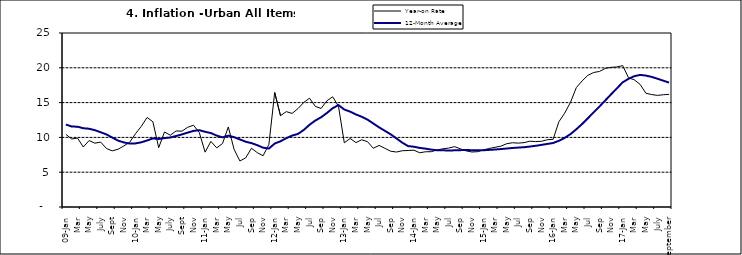
| Category | Year-on Rate | 12-Month Average |
|---|---|---|
| 09-Jan | 10.439 | 11.844 |
| Feb | 9.772 | 11.562 |
| Mar | 9.907 | 11.538 |
| Apr | 8.618 | 11.319 |
| May | 9.547 | 11.246 |
| June | 9.17 | 11.039 |
| July | 9.325 | 10.738 |
| Aug | 8.401 | 10.424 |
| Sept | 8.07 | 9.973 |
| Oct | 8.3 | 9.535 |
| Nov | 8.781 | 9.278 |
| Dec | 9.298 | 9.117 |
| 10-Jan | 10.534 | 9.136 |
| Feb | 11.584 | 9.297 |
| Mar | 12.864 | 9.555 |
| Apr | 12.24 | 9.859 |
| May | 8.524 | 9.769 |
| June | 10.781 | 9.904 |
| July | 10.313 | 9.987 |
| Aug | 10.924 | 10.197 |
| Sept | 10.891 | 10.43 |
| Oct | 11.457 | 10.689 |
| Nov | 11.748 | 10.932 |
| Dec | 10.699 | 11.042 |
| 11-Jan | 7.878 | 10.806 |
| Feb | 9.426 | 10.623 |
| Mar | 8.498 | 10.26 |
| Apr | 9.11 | 10.005 |
| May | 11.5 | 10.249 |
| Jun | 8.278 | 10.034 |
| Jul | 6.608 | 9.711 |
| Aug | 7.061 | 9.38 |
| Sep | 8.443 | 9.178 |
| Oct | 7.802 | 8.88 |
| Nov | 7.365 | 8.525 |
| Dec | 8.993 | 8.395 |
| 12-Jan | 16.445 | 9.119 |
| Feb | 13.123 | 9.443 |
| Mar | 13.701 | 9.889 |
| Apr | 13.447 | 10.259 |
| May | 14.127 | 10.496 |
| Jun | 15.012 | 11.062 |
| Jul | 15.63 | 11.81 |
| Aug | 14.456 | 12.422 |
| Sep | 14.162 | 12.893 |
| Oct | 15.26 | 13.506 |
| Nov | 15.836 | 14.199 |
| Dec | 14.459 | 14.637 |
| 13-Jan | 9.22 | 14.006 |
| Feb | 9.85 | 13.703 |
| Mar | 9.253 | 13.302 |
| Apr | 9.657 | 12.966 |
| May | 9.385 | 12.557 |
| Jun | 8.441 | 11.999 |
| Jul | 8.849 | 11.443 |
| Aug | 8.431 | 10.946 |
| Sep | 8.013 | 10.44 |
| Oct | 7.9 | 9.849 |
| Nov | 8.086 | 9.245 |
| Dec | 8.117 | 8.75 |
| 14-Jan | 8.164 | 8.662 |
| Feb | 7.791 | 8.493 |
| Mar | 7.937 | 8.384 |
| Apr | 7.947 | 8.246 |
| May | 8.195 | 8.151 |
| Jun | 8.358 | 8.146 |
| Jul | 8.464 | 8.118 |
| Aug | 8.673 | 8.141 |
| Sep | 8.357 | 8.17 |
| Oct | 8.064 | 8.182 |
| Nov | 7.902 | 8.165 |
| Dec | 7.948 | 8.151 |
| 15-Jan | 8.211 | 8.155 |
| Feb | 8.412 | 8.206 |
| Mar | 8.579 | 8.26 |
| Apr | 8.742 | 8.326 |
| May | 9.092 | 8.403 |
| Jun | 9.232 | 8.478 |
| Jul | 9.177 | 8.54 |
| Aug | 9.25 | 8.591 |
| Sep | 9.455 | 8.684 |
| Oct | 9.398 | 8.795 |
| Nov | 9.442 | 8.922 |
| Dec | 9.665 | 9.064 |
| 16-Jan | 9.728 | 9.19 |
| Feb | 12.254 | 9.516 |
| Mar | 13.485 | 9.935 |
| Apr | 15.052 | 10.474 |
| May | 17.148 | 11.165 |
| Jun | 18.111 | 11.925 |
| Jul | 18.927 | 12.754 |
| Aug | 19.325 | 13.605 |
| Sep | 19.476 | 14.444 |
| Oct | 19.914 | 15.318 |
| Nov | 20.067 | 16.193 |
| Dec | 20.118 | 17.05 |
| 17-Jan | 20.315 | 17.914 |
| Feb | 18.569 | 18.418 |
| Mar | 18.27 | 18.794 |
| Apr | 17.621 | 18.982 |
| May | 16.343 | 18.883 |
| June | 16.153 | 18.692 |
| July | 16.038 | 18.43 |
| August | 16.128 | 18.151 |
| September | 16.183 | 17.872 |